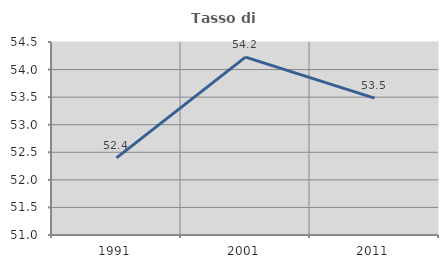
| Category | Tasso di occupazione   |
|---|---|
| 1991.0 | 52.399 |
| 2001.0 | 54.226 |
| 2011.0 | 53.483 |